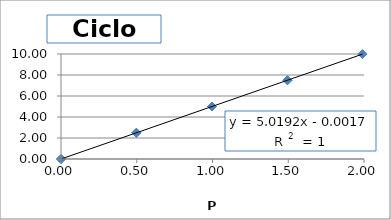
| Category | Output (V) |
|---|---|
| 0.0 | 0 |
| 0.49760000000000004 | 2.5 |
| 0.9968 | 5 |
| 1.495 | 7.5 |
| 1.9898000000000002 | 9.99 |
| 1.495 | 7.5 |
| 0.9968 | 5 |
| 0.49760000000000004 | 2.49 |
| 0.0 | 0 |